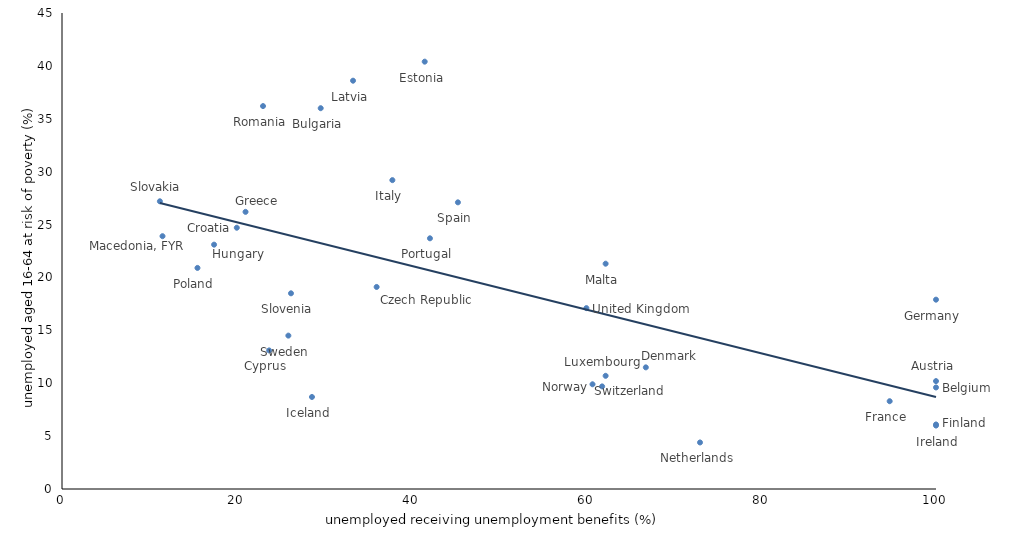
| Category | Proportion of unemployed receiving unemployment benefits and relative poverty rates  for the unemployed, selected European countries, 2015 |
|---|---|
| 100.0 | 9.6 |
| 29.6 | 36 |
| 36.0 | 19.1 |
| 66.8 | 11.5 |
| 100.0 | 17.9 |
| 41.5 | 40.4 |
| 100.0 | 6 |
| 21.0 | 26.2 |
| 45.3 | 27.1 |
| 94.7 | 8.3 |
| 20.0 | 24.7 |
| 37.8 | 29.2 |
| 23.7 | 13.1 |
| 33.3 | 38.6 |
| 62.2 | 10.7 |
| 17.4 | 23.1 |
| 62.2 | 21.3 |
| 73.0 | 4.4 |
| 100.0 | 10.2 |
| 15.5 | 20.9 |
| 42.1 | 23.7 |
| 23.0 | 36.2 |
| 26.2 | 18.5 |
| 11.2 | 27.2 |
| 100.0 | 6.1 |
| 25.9 | 14.5 |
| 60.0 | 17.1 |
| 28.6 | 8.7 |
| 61.8 | 9.7 |
| 60.7 | 9.9 |
| 11.5 | 23.9 |